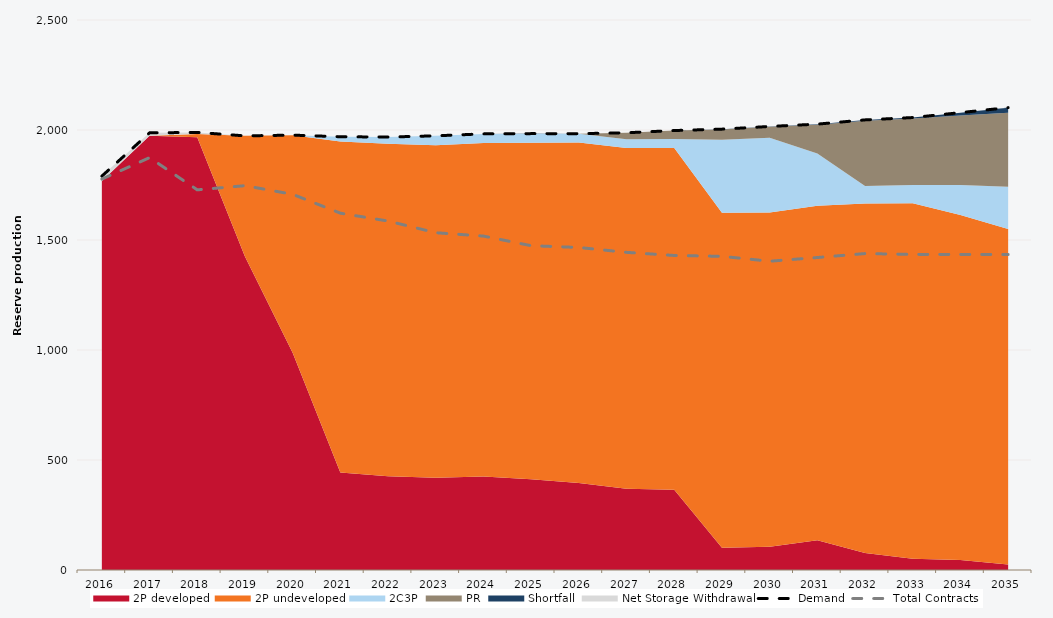
| Category | Demand | Total Contracts |
|---|---|---|
| 0 | 1790.311 | 1776.781 |
| 1 | 1987.1 | 1874.371 |
| 2 | 1988.981 | 1727.997 |
| 3 | 1973.331 | 1746.967 |
| 4 | 1976.659 | 1707.643 |
| 5 | 1969.416 | 1621.977 |
| 6 | 1967.937 | 1586.126 |
| 7 | 1973.509 | 1533.126 |
| 8 | 1982.37 | 1517.777 |
| 9 | 1983.534 | 1474.136 |
| 10 | 1983.321 | 1466.013 |
| 11 | 1987.361 | 1443.817 |
| 12 | 1997.544 | 1429.645 |
| 13 | 2003.869 | 1425.788 |
| 14 | 2016.117 | 1403.548 |
| 15 | 2026.679 | 1420.349 |
| 16 | 2045.948 | 1438.314 |
| 17 | 2056.572 | 1434.467 |
| 18 | 2078.974 | 1434.453 |
| 19 | 2101.786 | 1434.032 |